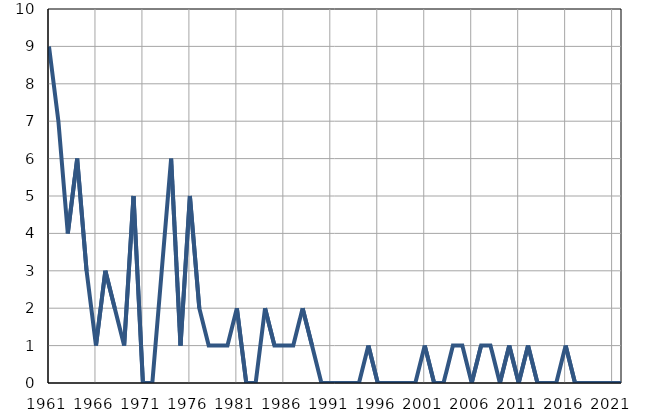
| Category | Умрла 
одојчад |
|---|---|
| 1961.0 | 9 |
| 1962.0 | 7 |
| 1963.0 | 4 |
| 1964.0 | 6 |
| 1965.0 | 3 |
| 1966.0 | 1 |
| 1967.0 | 3 |
| 1968.0 | 2 |
| 1969.0 | 1 |
| 1970.0 | 5 |
| 1971.0 | 0 |
| 1972.0 | 0 |
| 1973.0 | 3 |
| 1974.0 | 6 |
| 1975.0 | 1 |
| 1976.0 | 5 |
| 1977.0 | 2 |
| 1978.0 | 1 |
| 1979.0 | 1 |
| 1980.0 | 1 |
| 1981.0 | 2 |
| 1982.0 | 0 |
| 1983.0 | 0 |
| 1984.0 | 2 |
| 1985.0 | 1 |
| 1986.0 | 1 |
| 1987.0 | 1 |
| 1988.0 | 2 |
| 1989.0 | 1 |
| 1990.0 | 0 |
| 1991.0 | 0 |
| 1992.0 | 0 |
| 1993.0 | 0 |
| 1994.0 | 0 |
| 1995.0 | 1 |
| 1996.0 | 0 |
| 1997.0 | 0 |
| 1998.0 | 0 |
| 1999.0 | 0 |
| 2000.0 | 0 |
| 2001.0 | 1 |
| 2002.0 | 0 |
| 2003.0 | 0 |
| 2004.0 | 1 |
| 2005.0 | 1 |
| 2006.0 | 0 |
| 2007.0 | 1 |
| 2008.0 | 1 |
| 2009.0 | 0 |
| 2010.0 | 1 |
| 2011.0 | 0 |
| 2012.0 | 1 |
| 2013.0 | 0 |
| 2014.0 | 0 |
| 2015.0 | 0 |
| 2016.0 | 1 |
| 2017.0 | 0 |
| 2018.0 | 0 |
| 2019.0 | 0 |
| 2020.0 | 0 |
| 2021.0 | 0 |
| 2022.0 | 0 |